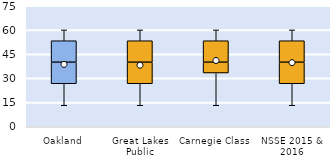
| Category | 25th | 50th | 75th |
|---|---|---|---|
| Oakland | 26.667 | 13.333 | 13.333 |
| Great Lakes Public | 26.667 | 13.333 | 13.333 |
| Carnegie Class | 33.333 | 6.667 | 13.333 |
| NSSE 2015 & 2016 | 26.667 | 13.333 | 13.333 |